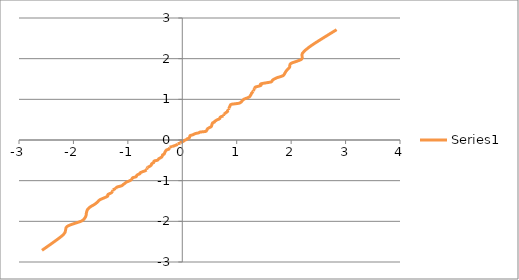
| Category | Series 0 |
|---|---|
| -2.5775807444006205 | -2.713 |
| -2.183587639592588 | -2.326 |
| -2.1179312170716003 | -2.128 |
| -1.8469108908902854 | -1.989 |
| -1.7748061509337276 | -1.881 |
| -1.7609363567316905 | -1.791 |
| -1.7424827092327178 | -1.713 |
| -1.690432327450253 | -1.645 |
| -1.6123976820381358 | -1.583 |
| -1.5588921087328345 | -1.527 |
| -1.5215709936455823 | -1.476 |
| -1.4441866369452327 | -1.428 |
| -1.371849975839723 | -1.383 |
| -1.3659928299603052 | -1.341 |
| -1.3058752301731147 | -1.301 |
| -1.279763637285214 | -1.263 |
| -1.2776831681549083 | -1.227 |
| -1.2210875866003335 | -1.192 |
| -1.201178747578524 | -1.158 |
| -1.1157385415572207 | -1.126 |
| -1.0867006494663656 | -1.095 |
| -1.0546750672801863 | -1.065 |
| -1.0269309314026032 | -1.036 |
| -0.9776294973562472 | -1.008 |
| -0.9398377187608276 | -0.981 |
| -0.9231916919816285 | -0.954 |
| -0.9109612619795371 | -0.928 |
| -0.8472375156998169 | -0.903 |
| -0.8399217676924309 | -0.878 |
| -0.8211281965486705 | -0.854 |
| -0.7798166734573897 | -0.83 |
| -0.77350705396384 | -0.806 |
| -0.7364769771811552 | -0.784 |
| -0.6902041604917031 | -0.761 |
| -0.6549066711158957 | -0.739 |
| -0.6540540198329836 | -0.717 |
| -0.6535799457196845 | -0.696 |
| -0.6365314675349509 | -0.674 |
| -0.6083041625970509 | -0.654 |
| -0.5818219506181777 | -0.633 |
| -0.5679248715750873 | -0.613 |
| -0.5664878699462861 | -0.593 |
| -0.5495940058608539 | -0.573 |
| -0.5237950517766876 | -0.553 |
| -0.5237950517766876 | -0.534 |
| -0.5132073965796735 | -0.515 |
| -0.4533615083346376 | -0.496 |
| -0.4407661435834598 | -0.477 |
| -0.4289927346690092 | -0.458 |
| -0.40404756873613223 | -0.44 |
| -0.3813238436123356 | -0.422 |
| -0.3702405138028553 | -0.403 |
| -0.3654929514596006 | -0.385 |
| -0.3628770173236262 | -0.367 |
| -0.33555693335074466 | -0.35 |
| -0.3269906301284209 | -0.332 |
| -0.3227160050300881 | -0.314 |
| -0.3164370809827233 | -0.297 |
| -0.311213170789415 | -0.279 |
| -0.3002321591338841 | -0.262 |
| -0.28888734959764406 | -0.245 |
| -0.24961991584859788 | -0.228 |
| -0.240947883867193 | -0.21 |
| -0.23426082407240756 | -0.193 |
| -0.23418124328600243 | -0.176 |
| -0.18615764929563738 | -0.159 |
| -0.14829879546596203 | -0.143 |
| -0.11627207641140558 | -0.126 |
| -0.0852844550536247 | -0.109 |
| -0.08451706889900379 | -0.092 |
| -0.032479192668688484 | -0.075 |
| -0.025514736989862286 | -0.059 |
| 0.001950866135302931 | -0.042 |
| 0.028117028705310076 | -0.025 |
| 0.04174125933786854 | -0.008 |
| 0.07223889042506926 | 0.008 |
| 0.0861291482578963 | 0.025 |
| 0.1129603788285749 | 0.042 |
| 0.13153567124390975 | 0.059 |
| 0.1348530531686265 | 0.075 |
| 0.1387149950460298 | 0.092 |
| 0.14350462151924148 | 0.109 |
| 0.18787090994010214 | 0.126 |
| 0.21347318579501007 | 0.143 |
| 0.24425730771326926 | 0.159 |
| 0.30391447580768727 | 0.176 |
| 0.322636424243683 | 0.193 |
| 0.4281548626750009 | 0.21 |
| 0.44422449718695134 | 0.228 |
| 0.45370143197942525 | 0.245 |
| 0.45641627366421744 | 0.262 |
| 0.466711753688287 | 0.279 |
| 0.4871981218457222 | 0.297 |
| 0.5132073965796735 | 0.314 |
| 0.5339120434655342 | 0.332 |
| 0.5389483703766018 | 0.35 |
| 0.541957660971093 | 0.367 |
| 0.5457718543766532 | 0.385 |
| 0.5505717126652598 | 0.403 |
| 0.5577976480708458 | 0.422 |
| 0.5889955900784116 | 0.44 |
| 0.5957417670288123 | 0.458 |
| 0.6179061529110186 | 0.477 |
| 0.6384061634889804 | 0.496 |
| 0.6751383807568345 | 0.515 |
| 0.6913683137099724 | 0.534 |
| 0.6939944796613418 | 0.553 |
| 0.7113249012036249 | 0.573 |
| 0.7576113603136037 | 0.593 |
| 0.7577136784675531 | 0.613 |
| 0.7642540822416777 | 0.633 |
| 0.7842822924430948 | 0.654 |
| 0.8030451681406703 | 0.674 |
| 0.8283313945867121 | 0.696 |
| 0.8298411557916552 | 0.717 |
| 0.8493202585668769 | 0.739 |
| 0.8494293979310896 | 0.761 |
| 0.8620077096566092 | 0.784 |
| 0.8656729733047541 | 0.806 |
| 0.8746087587496731 | 0.83 |
| 0.8809070095594507 | 0.854 |
| 0.9021914593176916 | 0.878 |
| 1.038274604070466 | 0.903 |
| 1.0759936230897438 | 0.928 |
| 1.0950225259875879 | 0.954 |
| 1.1111887943116017 | 0.981 |
| 1.1410406841605436 | 1.008 |
| 1.1983502190560102 | 1.036 |
| 1.2381951819406822 | 1.065 |
| 1.251978574146051 | 1.095 |
| 1.2666851034737192 | 1.126 |
| 1.2764735402015503 | 1.158 |
| 1.3039039004070219 | 1.192 |
| 1.3049793778918684 | 1.227 |
| 1.3321641745278612 | 1.263 |
| 1.3426415534922853 | 1.301 |
| 1.4437546269618906 | 1.341 |
| 1.447670001653023 | 1.383 |
| 1.6306239558616653 | 1.428 |
| 1.6614558262517676 | 1.476 |
| 1.733133103698492 | 1.527 |
| 1.852836248872336 | 1.583 |
| 1.8848459149012342 | 1.645 |
| 1.918915586429648 | 1.713 |
| 1.9722119759535417 | 1.791 |
| 1.9929575501009822 | 1.881 |
| 2.194501576013863 | 1.989 |
| 2.20568836084567 | 2.128 |
| 2.375654730712995 | 2.326 |
| 2.8353679226711392 | 2.713 |